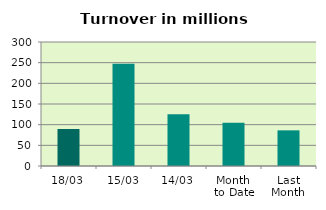
| Category | Series 0 |
|---|---|
| 18/03 | 89.588 |
| 15/03 | 247.413 |
| 14/03 | 125.409 |
| Month 
to Date | 104.82 |
| Last
Month | 86.247 |